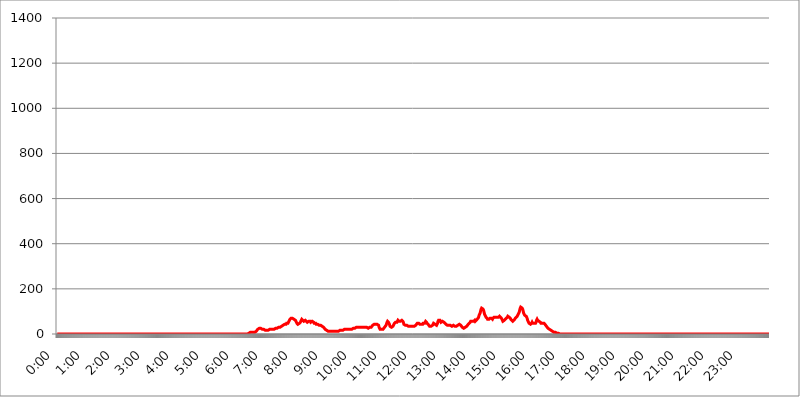
| Category | 2016.02.23. Intenzitás [W/m^2] |
|---|---|
| 0.0 | 0 |
| 0.0006944444444444445 | 0 |
| 0.001388888888888889 | 0 |
| 0.0020833333333333333 | 0 |
| 0.002777777777777778 | 0 |
| 0.003472222222222222 | 0 |
| 0.004166666666666667 | 0 |
| 0.004861111111111111 | 0 |
| 0.005555555555555556 | 0 |
| 0.0062499999999999995 | 0 |
| 0.006944444444444444 | 0 |
| 0.007638888888888889 | 0 |
| 0.008333333333333333 | 0 |
| 0.009027777777777779 | 0 |
| 0.009722222222222222 | 0 |
| 0.010416666666666666 | 0 |
| 0.011111111111111112 | 0 |
| 0.011805555555555555 | 0 |
| 0.012499999999999999 | 0 |
| 0.013194444444444444 | 0 |
| 0.013888888888888888 | 0 |
| 0.014583333333333332 | 0 |
| 0.015277777777777777 | 0 |
| 0.015972222222222224 | 0 |
| 0.016666666666666666 | 0 |
| 0.017361111111111112 | 0 |
| 0.018055555555555557 | 0 |
| 0.01875 | 0 |
| 0.019444444444444445 | 0 |
| 0.02013888888888889 | 0 |
| 0.020833333333333332 | 0 |
| 0.02152777777777778 | 0 |
| 0.022222222222222223 | 0 |
| 0.02291666666666667 | 0 |
| 0.02361111111111111 | 0 |
| 0.024305555555555556 | 0 |
| 0.024999999999999998 | 0 |
| 0.025694444444444447 | 0 |
| 0.02638888888888889 | 0 |
| 0.027083333333333334 | 0 |
| 0.027777777777777776 | 0 |
| 0.02847222222222222 | 0 |
| 0.029166666666666664 | 0 |
| 0.029861111111111113 | 0 |
| 0.030555555555555555 | 0 |
| 0.03125 | 0 |
| 0.03194444444444445 | 0 |
| 0.03263888888888889 | 0 |
| 0.03333333333333333 | 0 |
| 0.034027777777777775 | 0 |
| 0.034722222222222224 | 0 |
| 0.035416666666666666 | 0 |
| 0.036111111111111115 | 0 |
| 0.03680555555555556 | 0 |
| 0.0375 | 0 |
| 0.03819444444444444 | 0 |
| 0.03888888888888889 | 0 |
| 0.03958333333333333 | 0 |
| 0.04027777777777778 | 0 |
| 0.04097222222222222 | 0 |
| 0.041666666666666664 | 0 |
| 0.042361111111111106 | 0 |
| 0.04305555555555556 | 0 |
| 0.043750000000000004 | 0 |
| 0.044444444444444446 | 0 |
| 0.04513888888888889 | 0 |
| 0.04583333333333334 | 0 |
| 0.04652777777777778 | 0 |
| 0.04722222222222222 | 0 |
| 0.04791666666666666 | 0 |
| 0.04861111111111111 | 0 |
| 0.049305555555555554 | 0 |
| 0.049999999999999996 | 0 |
| 0.05069444444444445 | 0 |
| 0.051388888888888894 | 0 |
| 0.052083333333333336 | 0 |
| 0.05277777777777778 | 0 |
| 0.05347222222222222 | 0 |
| 0.05416666666666667 | 0 |
| 0.05486111111111111 | 0 |
| 0.05555555555555555 | 0 |
| 0.05625 | 0 |
| 0.05694444444444444 | 0 |
| 0.057638888888888885 | 0 |
| 0.05833333333333333 | 0 |
| 0.05902777777777778 | 0 |
| 0.059722222222222225 | 0 |
| 0.06041666666666667 | 0 |
| 0.061111111111111116 | 0 |
| 0.06180555555555556 | 0 |
| 0.0625 | 0 |
| 0.06319444444444444 | 0 |
| 0.06388888888888888 | 0 |
| 0.06458333333333334 | 0 |
| 0.06527777777777778 | 0 |
| 0.06597222222222222 | 0 |
| 0.06666666666666667 | 0 |
| 0.06736111111111111 | 0 |
| 0.06805555555555555 | 0 |
| 0.06874999999999999 | 0 |
| 0.06944444444444443 | 0 |
| 0.07013888888888889 | 0 |
| 0.07083333333333333 | 0 |
| 0.07152777777777779 | 0 |
| 0.07222222222222223 | 0 |
| 0.07291666666666667 | 0 |
| 0.07361111111111111 | 0 |
| 0.07430555555555556 | 0 |
| 0.075 | 0 |
| 0.07569444444444444 | 0 |
| 0.0763888888888889 | 0 |
| 0.07708333333333334 | 0 |
| 0.07777777777777778 | 0 |
| 0.07847222222222222 | 0 |
| 0.07916666666666666 | 0 |
| 0.0798611111111111 | 0 |
| 0.08055555555555556 | 0 |
| 0.08125 | 0 |
| 0.08194444444444444 | 0 |
| 0.08263888888888889 | 0 |
| 0.08333333333333333 | 0 |
| 0.08402777777777777 | 0 |
| 0.08472222222222221 | 0 |
| 0.08541666666666665 | 0 |
| 0.08611111111111112 | 0 |
| 0.08680555555555557 | 0 |
| 0.08750000000000001 | 0 |
| 0.08819444444444445 | 0 |
| 0.08888888888888889 | 0 |
| 0.08958333333333333 | 0 |
| 0.09027777777777778 | 0 |
| 0.09097222222222222 | 0 |
| 0.09166666666666667 | 0 |
| 0.09236111111111112 | 0 |
| 0.09305555555555556 | 0 |
| 0.09375 | 0 |
| 0.09444444444444444 | 0 |
| 0.09513888888888888 | 0 |
| 0.09583333333333333 | 0 |
| 0.09652777777777777 | 0 |
| 0.09722222222222222 | 0 |
| 0.09791666666666667 | 0 |
| 0.09861111111111111 | 0 |
| 0.09930555555555555 | 0 |
| 0.09999999999999999 | 0 |
| 0.10069444444444443 | 0 |
| 0.1013888888888889 | 0 |
| 0.10208333333333335 | 0 |
| 0.10277777777777779 | 0 |
| 0.10347222222222223 | 0 |
| 0.10416666666666667 | 0 |
| 0.10486111111111111 | 0 |
| 0.10555555555555556 | 0 |
| 0.10625 | 0 |
| 0.10694444444444444 | 0 |
| 0.1076388888888889 | 0 |
| 0.10833333333333334 | 0 |
| 0.10902777777777778 | 0 |
| 0.10972222222222222 | 0 |
| 0.1111111111111111 | 0 |
| 0.11180555555555556 | 0 |
| 0.11180555555555556 | 0 |
| 0.1125 | 0 |
| 0.11319444444444444 | 0 |
| 0.11388888888888889 | 0 |
| 0.11458333333333333 | 0 |
| 0.11527777777777777 | 0 |
| 0.11597222222222221 | 0 |
| 0.11666666666666665 | 0 |
| 0.1173611111111111 | 0 |
| 0.11805555555555557 | 0 |
| 0.11944444444444445 | 0 |
| 0.12013888888888889 | 0 |
| 0.12083333333333333 | 0 |
| 0.12152777777777778 | 0 |
| 0.12222222222222223 | 0 |
| 0.12291666666666667 | 0 |
| 0.12291666666666667 | 0 |
| 0.12361111111111112 | 0 |
| 0.12430555555555556 | 0 |
| 0.125 | 0 |
| 0.12569444444444444 | 0 |
| 0.12638888888888888 | 0 |
| 0.12708333333333333 | 0 |
| 0.16875 | 0 |
| 0.12847222222222224 | 0 |
| 0.12916666666666668 | 0 |
| 0.12986111111111112 | 0 |
| 0.13055555555555556 | 0 |
| 0.13125 | 0 |
| 0.13194444444444445 | 0 |
| 0.1326388888888889 | 0 |
| 0.13333333333333333 | 0 |
| 0.13402777777777777 | 0 |
| 0.13402777777777777 | 0 |
| 0.13472222222222222 | 0 |
| 0.13541666666666666 | 0 |
| 0.1361111111111111 | 0 |
| 0.13749999999999998 | 0 |
| 0.13819444444444443 | 0 |
| 0.1388888888888889 | 0 |
| 0.13958333333333334 | 0 |
| 0.14027777777777778 | 0 |
| 0.14097222222222222 | 0 |
| 0.14166666666666666 | 0 |
| 0.1423611111111111 | 0 |
| 0.14305555555555557 | 0 |
| 0.14375000000000002 | 0 |
| 0.14444444444444446 | 0 |
| 0.1451388888888889 | 0 |
| 0.1451388888888889 | 0 |
| 0.14652777777777778 | 0 |
| 0.14722222222222223 | 0 |
| 0.14791666666666667 | 0 |
| 0.1486111111111111 | 0 |
| 0.14930555555555555 | 0 |
| 0.15 | 0 |
| 0.15069444444444444 | 0 |
| 0.15138888888888888 | 0 |
| 0.15208333333333332 | 0 |
| 0.15277777777777776 | 0 |
| 0.15347222222222223 | 0 |
| 0.15416666666666667 | 0 |
| 0.15486111111111112 | 0 |
| 0.15555555555555556 | 0 |
| 0.15625 | 0 |
| 0.15694444444444444 | 0 |
| 0.15763888888888888 | 0 |
| 0.15833333333333333 | 0 |
| 0.15902777777777777 | 0 |
| 0.15972222222222224 | 0 |
| 0.16041666666666668 | 0 |
| 0.16111111111111112 | 0 |
| 0.16180555555555556 | 0 |
| 0.1625 | 0 |
| 0.16319444444444445 | 0 |
| 0.1638888888888889 | 0 |
| 0.16458333333333333 | 0 |
| 0.16527777777777777 | 0 |
| 0.16597222222222222 | 0 |
| 0.16666666666666666 | 0 |
| 0.1673611111111111 | 0 |
| 0.16805555555555554 | 0 |
| 0.16874999999999998 | 0 |
| 0.16944444444444443 | 0 |
| 0.17013888888888887 | 0 |
| 0.1708333333333333 | 0 |
| 0.17152777777777775 | 0 |
| 0.17222222222222225 | 0 |
| 0.1729166666666667 | 0 |
| 0.17361111111111113 | 0 |
| 0.17430555555555557 | 0 |
| 0.17500000000000002 | 0 |
| 0.17569444444444446 | 0 |
| 0.1763888888888889 | 0 |
| 0.17708333333333334 | 0 |
| 0.17777777777777778 | 0 |
| 0.17847222222222223 | 0 |
| 0.17916666666666667 | 0 |
| 0.1798611111111111 | 0 |
| 0.18055555555555555 | 0 |
| 0.18125 | 0 |
| 0.18194444444444444 | 0 |
| 0.1826388888888889 | 0 |
| 0.18333333333333335 | 0 |
| 0.1840277777777778 | 0 |
| 0.18472222222222223 | 0 |
| 0.18541666666666667 | 0 |
| 0.18611111111111112 | 0 |
| 0.18680555555555556 | 0 |
| 0.1875 | 0 |
| 0.18819444444444444 | 0 |
| 0.18888888888888888 | 0 |
| 0.18958333333333333 | 0 |
| 0.19027777777777777 | 0 |
| 0.1909722222222222 | 0 |
| 0.19166666666666665 | 0 |
| 0.19236111111111112 | 0 |
| 0.19305555555555554 | 0 |
| 0.19375 | 0 |
| 0.19444444444444445 | 0 |
| 0.1951388888888889 | 0 |
| 0.19583333333333333 | 0 |
| 0.19652777777777777 | 0 |
| 0.19722222222222222 | 0 |
| 0.19791666666666666 | 0 |
| 0.1986111111111111 | 0 |
| 0.19930555555555554 | 0 |
| 0.19999999999999998 | 0 |
| 0.20069444444444443 | 0 |
| 0.20138888888888887 | 0 |
| 0.2020833333333333 | 0 |
| 0.2027777777777778 | 0 |
| 0.2034722222222222 | 0 |
| 0.2041666666666667 | 0 |
| 0.20486111111111113 | 0 |
| 0.20555555555555557 | 0 |
| 0.20625000000000002 | 0 |
| 0.20694444444444446 | 0 |
| 0.2076388888888889 | 0 |
| 0.20833333333333334 | 0 |
| 0.20902777777777778 | 0 |
| 0.20972222222222223 | 0 |
| 0.21041666666666667 | 0 |
| 0.2111111111111111 | 0 |
| 0.21180555555555555 | 0 |
| 0.2125 | 0 |
| 0.21319444444444444 | 0 |
| 0.2138888888888889 | 0 |
| 0.21458333333333335 | 0 |
| 0.2152777777777778 | 0 |
| 0.21597222222222223 | 0 |
| 0.21666666666666667 | 0 |
| 0.21736111111111112 | 0 |
| 0.21805555555555556 | 0 |
| 0.21875 | 0 |
| 0.21944444444444444 | 0 |
| 0.22013888888888888 | 0 |
| 0.22083333333333333 | 0 |
| 0.22152777777777777 | 0 |
| 0.2222222222222222 | 0 |
| 0.22291666666666665 | 0 |
| 0.2236111111111111 | 0 |
| 0.22430555555555556 | 0 |
| 0.225 | 0 |
| 0.22569444444444445 | 0 |
| 0.2263888888888889 | 0 |
| 0.22708333333333333 | 0 |
| 0.22777777777777777 | 0 |
| 0.22847222222222222 | 0 |
| 0.22916666666666666 | 0 |
| 0.2298611111111111 | 0 |
| 0.23055555555555554 | 0 |
| 0.23124999999999998 | 0 |
| 0.23194444444444443 | 0 |
| 0.23263888888888887 | 0 |
| 0.2333333333333333 | 0 |
| 0.2340277777777778 | 0 |
| 0.2347222222222222 | 0 |
| 0.2354166666666667 | 0 |
| 0.23611111111111113 | 0 |
| 0.23680555555555557 | 0 |
| 0.23750000000000002 | 0 |
| 0.23819444444444446 | 0 |
| 0.2388888888888889 | 0 |
| 0.23958333333333334 | 0 |
| 0.24027777777777778 | 0 |
| 0.24097222222222223 | 0 |
| 0.24166666666666667 | 0 |
| 0.2423611111111111 | 0 |
| 0.24305555555555555 | 0 |
| 0.24375 | 0 |
| 0.24444444444444446 | 0 |
| 0.24513888888888888 | 0 |
| 0.24583333333333335 | 0 |
| 0.2465277777777778 | 0 |
| 0.24722222222222223 | 0 |
| 0.24791666666666667 | 0 |
| 0.24861111111111112 | 0 |
| 0.24930555555555556 | 0 |
| 0.25 | 0 |
| 0.25069444444444444 | 0 |
| 0.2513888888888889 | 0 |
| 0.2520833333333333 | 0 |
| 0.25277777777777777 | 0 |
| 0.2534722222222222 | 0 |
| 0.25416666666666665 | 0 |
| 0.2548611111111111 | 0 |
| 0.2555555555555556 | 0 |
| 0.25625000000000003 | 0 |
| 0.2569444444444445 | 0 |
| 0.2576388888888889 | 0 |
| 0.25833333333333336 | 0 |
| 0.2590277777777778 | 0 |
| 0.25972222222222224 | 0 |
| 0.2604166666666667 | 0 |
| 0.2611111111111111 | 0 |
| 0.26180555555555557 | 0 |
| 0.2625 | 0 |
| 0.26319444444444445 | 0 |
| 0.2638888888888889 | 0 |
| 0.26458333333333334 | 0 |
| 0.2652777777777778 | 0 |
| 0.2659722222222222 | 0 |
| 0.26666666666666666 | 0 |
| 0.2673611111111111 | 0 |
| 0.26805555555555555 | 0 |
| 0.26875 | 3.525 |
| 0.26944444444444443 | 3.525 |
| 0.2701388888888889 | 3.525 |
| 0.2708333333333333 | 7.887 |
| 0.27152777777777776 | 7.887 |
| 0.2722222222222222 | 7.887 |
| 0.27291666666666664 | 7.887 |
| 0.2736111111111111 | 7.887 |
| 0.2743055555555555 | 7.887 |
| 0.27499999999999997 | 7.887 |
| 0.27569444444444446 | 7.887 |
| 0.27638888888888885 | 7.887 |
| 0.27708333333333335 | 7.887 |
| 0.2777777777777778 | 7.887 |
| 0.27847222222222223 | 12.257 |
| 0.2791666666666667 | 12.257 |
| 0.2798611111111111 | 12.257 |
| 0.28055555555555556 | 16.636 |
| 0.28125 | 21.024 |
| 0.28194444444444444 | 21.024 |
| 0.2826388888888889 | 25.419 |
| 0.2833333333333333 | 25.419 |
| 0.28402777777777777 | 25.419 |
| 0.2847222222222222 | 25.419 |
| 0.28541666666666665 | 25.419 |
| 0.28611111111111115 | 25.419 |
| 0.28680555555555554 | 21.024 |
| 0.28750000000000003 | 21.024 |
| 0.2881944444444445 | 21.024 |
| 0.2888888888888889 | 21.024 |
| 0.28958333333333336 | 21.024 |
| 0.2902777777777778 | 21.024 |
| 0.29097222222222224 | 21.024 |
| 0.2916666666666667 | 16.636 |
| 0.2923611111111111 | 16.636 |
| 0.29305555555555557 | 16.636 |
| 0.29375 | 16.636 |
| 0.29444444444444445 | 16.636 |
| 0.2951388888888889 | 16.636 |
| 0.29583333333333334 | 16.636 |
| 0.2965277777777778 | 16.636 |
| 0.2972222222222222 | 21.024 |
| 0.29791666666666666 | 21.024 |
| 0.2986111111111111 | 21.024 |
| 0.29930555555555555 | 21.024 |
| 0.3 | 21.024 |
| 0.30069444444444443 | 21.024 |
| 0.3013888888888889 | 21.024 |
| 0.3020833333333333 | 21.024 |
| 0.30277777777777776 | 16.636 |
| 0.3034722222222222 | 16.636 |
| 0.30416666666666664 | 21.024 |
| 0.3048611111111111 | 21.024 |
| 0.3055555555555555 | 21.024 |
| 0.30624999999999997 | 25.419 |
| 0.3069444444444444 | 25.419 |
| 0.3076388888888889 | 25.419 |
| 0.30833333333333335 | 25.419 |
| 0.3090277777777778 | 29.823 |
| 0.30972222222222223 | 29.823 |
| 0.3104166666666667 | 29.823 |
| 0.3111111111111111 | 29.823 |
| 0.31180555555555556 | 29.823 |
| 0.3125 | 29.823 |
| 0.31319444444444444 | 34.234 |
| 0.3138888888888889 | 34.234 |
| 0.3145833333333333 | 34.234 |
| 0.31527777777777777 | 38.653 |
| 0.3159722222222222 | 38.653 |
| 0.31666666666666665 | 38.653 |
| 0.31736111111111115 | 38.653 |
| 0.31805555555555554 | 38.653 |
| 0.31875000000000003 | 43.079 |
| 0.3194444444444445 | 43.079 |
| 0.3201388888888889 | 43.079 |
| 0.32083333333333336 | 43.079 |
| 0.3215277777777778 | 47.511 |
| 0.32222222222222224 | 47.511 |
| 0.3229166666666667 | 47.511 |
| 0.3236111111111111 | 47.511 |
| 0.32430555555555557 | 51.951 |
| 0.325 | 56.398 |
| 0.32569444444444445 | 60.85 |
| 0.3263888888888889 | 65.31 |
| 0.32708333333333334 | 65.31 |
| 0.3277777777777778 | 69.775 |
| 0.3284722222222222 | 69.775 |
| 0.32916666666666666 | 69.775 |
| 0.3298611111111111 | 69.775 |
| 0.33055555555555555 | 69.775 |
| 0.33125 | 69.775 |
| 0.33194444444444443 | 65.31 |
| 0.3326388888888889 | 65.31 |
| 0.3333333333333333 | 65.31 |
| 0.3340277777777778 | 60.85 |
| 0.3347222222222222 | 56.398 |
| 0.3354166666666667 | 51.951 |
| 0.3361111111111111 | 47.511 |
| 0.3368055555555556 | 47.511 |
| 0.33749999999999997 | 43.079 |
| 0.33819444444444446 | 43.079 |
| 0.33888888888888885 | 43.079 |
| 0.33958333333333335 | 47.511 |
| 0.34027777777777773 | 47.511 |
| 0.34097222222222223 | 51.951 |
| 0.3416666666666666 | 56.398 |
| 0.3423611111111111 | 60.85 |
| 0.3430555555555555 | 65.31 |
| 0.34375 | 65.31 |
| 0.3444444444444445 | 60.85 |
| 0.3451388888888889 | 60.85 |
| 0.3458333333333334 | 56.398 |
| 0.34652777777777777 | 56.398 |
| 0.34722222222222227 | 56.398 |
| 0.34791666666666665 | 60.85 |
| 0.34861111111111115 | 60.85 |
| 0.34930555555555554 | 56.398 |
| 0.35000000000000003 | 56.398 |
| 0.3506944444444444 | 51.951 |
| 0.3513888888888889 | 51.951 |
| 0.3520833333333333 | 51.951 |
| 0.3527777777777778 | 56.398 |
| 0.3534722222222222 | 56.398 |
| 0.3541666666666667 | 56.398 |
| 0.3548611111111111 | 56.398 |
| 0.35555555555555557 | 51.951 |
| 0.35625 | 51.951 |
| 0.35694444444444445 | 51.951 |
| 0.3576388888888889 | 56.398 |
| 0.35833333333333334 | 56.398 |
| 0.3590277777777778 | 56.398 |
| 0.3597222222222222 | 51.951 |
| 0.36041666666666666 | 47.511 |
| 0.3611111111111111 | 47.511 |
| 0.36180555555555555 | 47.511 |
| 0.3625 | 47.511 |
| 0.36319444444444443 | 43.079 |
| 0.3638888888888889 | 43.079 |
| 0.3645833333333333 | 43.079 |
| 0.3652777777777778 | 43.079 |
| 0.3659722222222222 | 43.079 |
| 0.3666666666666667 | 43.079 |
| 0.3673611111111111 | 38.653 |
| 0.3680555555555556 | 38.653 |
| 0.36874999999999997 | 38.653 |
| 0.36944444444444446 | 38.653 |
| 0.37013888888888885 | 38.653 |
| 0.37083333333333335 | 38.653 |
| 0.37152777777777773 | 34.234 |
| 0.37222222222222223 | 34.234 |
| 0.3729166666666666 | 29.823 |
| 0.3736111111111111 | 29.823 |
| 0.3743055555555555 | 29.823 |
| 0.375 | 25.419 |
| 0.3756944444444445 | 21.024 |
| 0.3763888888888889 | 21.024 |
| 0.3770833333333334 | 16.636 |
| 0.37777777777777777 | 16.636 |
| 0.37847222222222227 | 16.636 |
| 0.37916666666666665 | 12.257 |
| 0.37986111111111115 | 12.257 |
| 0.38055555555555554 | 12.257 |
| 0.38125000000000003 | 12.257 |
| 0.3819444444444444 | 12.257 |
| 0.3826388888888889 | 12.257 |
| 0.3833333333333333 | 12.257 |
| 0.3840277777777778 | 12.257 |
| 0.3847222222222222 | 12.257 |
| 0.3854166666666667 | 12.257 |
| 0.3861111111111111 | 12.257 |
| 0.38680555555555557 | 12.257 |
| 0.3875 | 12.257 |
| 0.38819444444444445 | 12.257 |
| 0.3888888888888889 | 12.257 |
| 0.38958333333333334 | 12.257 |
| 0.3902777777777778 | 12.257 |
| 0.3909722222222222 | 12.257 |
| 0.39166666666666666 | 12.257 |
| 0.3923611111111111 | 12.257 |
| 0.39305555555555555 | 12.257 |
| 0.39375 | 12.257 |
| 0.39444444444444443 | 12.257 |
| 0.3951388888888889 | 12.257 |
| 0.3958333333333333 | 12.257 |
| 0.3965277777777778 | 16.636 |
| 0.3972222222222222 | 16.636 |
| 0.3979166666666667 | 16.636 |
| 0.3986111111111111 | 16.636 |
| 0.3993055555555556 | 16.636 |
| 0.39999999999999997 | 16.636 |
| 0.40069444444444446 | 16.636 |
| 0.40138888888888885 | 21.024 |
| 0.40208333333333335 | 21.024 |
| 0.40277777777777773 | 21.024 |
| 0.40347222222222223 | 21.024 |
| 0.4041666666666666 | 21.024 |
| 0.4048611111111111 | 21.024 |
| 0.4055555555555555 | 21.024 |
| 0.40625 | 21.024 |
| 0.4069444444444445 | 21.024 |
| 0.4076388888888889 | 21.024 |
| 0.4083333333333334 | 21.024 |
| 0.40902777777777777 | 21.024 |
| 0.40972222222222227 | 21.024 |
| 0.41041666666666665 | 21.024 |
| 0.41111111111111115 | 21.024 |
| 0.41180555555555554 | 21.024 |
| 0.41250000000000003 | 21.024 |
| 0.4131944444444444 | 21.024 |
| 0.4138888888888889 | 21.024 |
| 0.4145833333333333 | 21.024 |
| 0.4152777777777778 | 25.419 |
| 0.4159722222222222 | 25.419 |
| 0.4166666666666667 | 25.419 |
| 0.4173611111111111 | 25.419 |
| 0.41805555555555557 | 29.823 |
| 0.41875 | 29.823 |
| 0.41944444444444445 | 29.823 |
| 0.4201388888888889 | 25.419 |
| 0.42083333333333334 | 29.823 |
| 0.4215277777777778 | 29.823 |
| 0.4222222222222222 | 29.823 |
| 0.42291666666666666 | 29.823 |
| 0.4236111111111111 | 29.823 |
| 0.42430555555555555 | 29.823 |
| 0.425 | 29.823 |
| 0.42569444444444443 | 29.823 |
| 0.4263888888888889 | 29.823 |
| 0.4270833333333333 | 29.823 |
| 0.4277777777777778 | 29.823 |
| 0.4284722222222222 | 29.823 |
| 0.4291666666666667 | 29.823 |
| 0.4298611111111111 | 29.823 |
| 0.4305555555555556 | 29.823 |
| 0.43124999999999997 | 29.823 |
| 0.43194444444444446 | 29.823 |
| 0.43263888888888885 | 29.823 |
| 0.43333333333333335 | 29.823 |
| 0.43402777777777773 | 29.823 |
| 0.43472222222222223 | 29.823 |
| 0.4354166666666666 | 25.419 |
| 0.4361111111111111 | 25.419 |
| 0.4368055555555555 | 25.419 |
| 0.4375 | 29.823 |
| 0.4381944444444445 | 29.823 |
| 0.4388888888888889 | 29.823 |
| 0.4395833333333334 | 29.823 |
| 0.44027777777777777 | 29.823 |
| 0.44097222222222227 | 29.823 |
| 0.44166666666666665 | 34.234 |
| 0.44236111111111115 | 38.653 |
| 0.44305555555555554 | 38.653 |
| 0.44375000000000003 | 43.079 |
| 0.4444444444444444 | 43.079 |
| 0.4451388888888889 | 43.079 |
| 0.4458333333333333 | 43.079 |
| 0.4465277777777778 | 43.079 |
| 0.4472222222222222 | 43.079 |
| 0.4479166666666667 | 43.079 |
| 0.4486111111111111 | 43.079 |
| 0.44930555555555557 | 43.079 |
| 0.45 | 38.653 |
| 0.45069444444444445 | 38.653 |
| 0.4513888888888889 | 29.823 |
| 0.45208333333333334 | 25.419 |
| 0.4527777777777778 | 21.024 |
| 0.4534722222222222 | 21.024 |
| 0.45416666666666666 | 21.024 |
| 0.4548611111111111 | 21.024 |
| 0.45555555555555555 | 21.024 |
| 0.45625 | 21.024 |
| 0.45694444444444443 | 21.024 |
| 0.4576388888888889 | 25.419 |
| 0.4583333333333333 | 25.419 |
| 0.4590277777777778 | 29.823 |
| 0.4597222222222222 | 29.823 |
| 0.4604166666666667 | 34.234 |
| 0.4611111111111111 | 38.653 |
| 0.4618055555555556 | 43.079 |
| 0.46249999999999997 | 51.951 |
| 0.46319444444444446 | 56.398 |
| 0.46388888888888885 | 56.398 |
| 0.46458333333333335 | 51.951 |
| 0.46527777777777773 | 47.511 |
| 0.46597222222222223 | 43.079 |
| 0.4666666666666666 | 34.234 |
| 0.4673611111111111 | 29.823 |
| 0.4680555555555555 | 29.823 |
| 0.46875 | 29.823 |
| 0.4694444444444445 | 34.234 |
| 0.4701388888888889 | 34.234 |
| 0.4708333333333334 | 34.234 |
| 0.47152777777777777 | 38.653 |
| 0.47222222222222227 | 43.079 |
| 0.47291666666666665 | 47.511 |
| 0.47361111111111115 | 47.511 |
| 0.47430555555555554 | 51.951 |
| 0.47500000000000003 | 51.951 |
| 0.4756944444444444 | 51.951 |
| 0.4763888888888889 | 51.951 |
| 0.4770833333333333 | 56.398 |
| 0.4777777777777778 | 60.85 |
| 0.4784722222222222 | 60.85 |
| 0.4791666666666667 | 56.398 |
| 0.4798611111111111 | 56.398 |
| 0.48055555555555557 | 56.398 |
| 0.48125 | 56.398 |
| 0.48194444444444445 | 56.398 |
| 0.4826388888888889 | 56.398 |
| 0.48333333333333334 | 60.85 |
| 0.4840277777777778 | 60.85 |
| 0.4847222222222222 | 56.398 |
| 0.48541666666666666 | 51.951 |
| 0.4861111111111111 | 43.079 |
| 0.48680555555555555 | 43.079 |
| 0.4875 | 38.653 |
| 0.48819444444444443 | 38.653 |
| 0.4888888888888889 | 38.653 |
| 0.4895833333333333 | 38.653 |
| 0.4902777777777778 | 38.653 |
| 0.4909722222222222 | 34.234 |
| 0.4916666666666667 | 34.234 |
| 0.4923611111111111 | 34.234 |
| 0.4930555555555556 | 34.234 |
| 0.49374999999999997 | 34.234 |
| 0.49444444444444446 | 34.234 |
| 0.49513888888888885 | 34.234 |
| 0.49583333333333335 | 34.234 |
| 0.49652777777777773 | 34.234 |
| 0.49722222222222223 | 34.234 |
| 0.4979166666666666 | 34.234 |
| 0.4986111111111111 | 34.234 |
| 0.4993055555555555 | 34.234 |
| 0.5 | 34.234 |
| 0.5006944444444444 | 34.234 |
| 0.5013888888888889 | 34.234 |
| 0.5020833333333333 | 34.234 |
| 0.5027777777777778 | 38.653 |
| 0.5034722222222222 | 38.653 |
| 0.5041666666666667 | 43.079 |
| 0.5048611111111111 | 47.511 |
| 0.5055555555555555 | 47.511 |
| 0.50625 | 47.511 |
| 0.5069444444444444 | 47.511 |
| 0.5076388888888889 | 47.511 |
| 0.5083333333333333 | 43.079 |
| 0.5090277777777777 | 43.079 |
| 0.5097222222222222 | 43.079 |
| 0.5104166666666666 | 43.079 |
| 0.5111111111111112 | 43.079 |
| 0.5118055555555555 | 43.079 |
| 0.5125000000000001 | 43.079 |
| 0.5131944444444444 | 47.511 |
| 0.513888888888889 | 47.511 |
| 0.5145833333333333 | 47.511 |
| 0.5152777777777778 | 47.511 |
| 0.5159722222222222 | 51.951 |
| 0.5166666666666667 | 56.398 |
| 0.517361111111111 | 56.398 |
| 0.5180555555555556 | 51.951 |
| 0.5187499999999999 | 47.511 |
| 0.5194444444444445 | 47.511 |
| 0.5201388888888888 | 43.079 |
| 0.5208333333333334 | 38.653 |
| 0.5215277777777778 | 38.653 |
| 0.5222222222222223 | 34.234 |
| 0.5229166666666667 | 34.234 |
| 0.5236111111111111 | 34.234 |
| 0.5243055555555556 | 34.234 |
| 0.525 | 34.234 |
| 0.5256944444444445 | 38.653 |
| 0.5263888888888889 | 38.653 |
| 0.5270833333333333 | 43.079 |
| 0.5277777777777778 | 47.511 |
| 0.5284722222222222 | 47.511 |
| 0.5291666666666667 | 47.511 |
| 0.5298611111111111 | 43.079 |
| 0.5305555555555556 | 38.653 |
| 0.53125 | 38.653 |
| 0.5319444444444444 | 38.653 |
| 0.5326388888888889 | 43.079 |
| 0.5333333333333333 | 47.511 |
| 0.5340277777777778 | 56.398 |
| 0.5347222222222222 | 60.85 |
| 0.5354166666666667 | 60.85 |
| 0.5361111111111111 | 60.85 |
| 0.5368055555555555 | 60.85 |
| 0.5375 | 56.398 |
| 0.5381944444444444 | 51.951 |
| 0.5388888888888889 | 51.951 |
| 0.5395833333333333 | 51.951 |
| 0.5402777777777777 | 56.398 |
| 0.5409722222222222 | 56.398 |
| 0.5416666666666666 | 56.398 |
| 0.5423611111111112 | 51.951 |
| 0.5430555555555555 | 51.951 |
| 0.5437500000000001 | 47.511 |
| 0.5444444444444444 | 47.511 |
| 0.545138888888889 | 43.079 |
| 0.5458333333333333 | 38.653 |
| 0.5465277777777778 | 38.653 |
| 0.5472222222222222 | 38.653 |
| 0.5479166666666667 | 38.653 |
| 0.548611111111111 | 38.653 |
| 0.5493055555555556 | 38.653 |
| 0.5499999999999999 | 38.653 |
| 0.5506944444444445 | 38.653 |
| 0.5513888888888888 | 38.653 |
| 0.5520833333333334 | 34.234 |
| 0.5527777777777778 | 34.234 |
| 0.5534722222222223 | 34.234 |
| 0.5541666666666667 | 34.234 |
| 0.5548611111111111 | 38.653 |
| 0.5555555555555556 | 38.653 |
| 0.55625 | 38.653 |
| 0.5569444444444445 | 38.653 |
| 0.5576388888888889 | 34.234 |
| 0.5583333333333333 | 34.234 |
| 0.5590277777777778 | 34.234 |
| 0.5597222222222222 | 34.234 |
| 0.5604166666666667 | 34.234 |
| 0.5611111111111111 | 34.234 |
| 0.5618055555555556 | 38.653 |
| 0.5625 | 38.653 |
| 0.5631944444444444 | 38.653 |
| 0.5638888888888889 | 43.079 |
| 0.5645833333333333 | 38.653 |
| 0.5652777777777778 | 38.653 |
| 0.5659722222222222 | 38.653 |
| 0.5666666666666667 | 38.653 |
| 0.5673611111111111 | 34.234 |
| 0.5680555555555555 | 29.823 |
| 0.56875 | 29.823 |
| 0.5694444444444444 | 25.419 |
| 0.5701388888888889 | 25.419 |
| 0.5708333333333333 | 29.823 |
| 0.5715277777777777 | 29.823 |
| 0.5722222222222222 | 29.823 |
| 0.5729166666666666 | 29.823 |
| 0.5736111111111112 | 34.234 |
| 0.5743055555555555 | 34.234 |
| 0.5750000000000001 | 38.653 |
| 0.5756944444444444 | 38.653 |
| 0.576388888888889 | 43.079 |
| 0.5770833333333333 | 43.079 |
| 0.5777777777777778 | 47.511 |
| 0.5784722222222222 | 47.511 |
| 0.5791666666666667 | 51.951 |
| 0.579861111111111 | 56.398 |
| 0.5805555555555556 | 56.398 |
| 0.5812499999999999 | 56.398 |
| 0.5819444444444445 | 56.398 |
| 0.5826388888888888 | 56.398 |
| 0.5833333333333334 | 56.398 |
| 0.5840277777777778 | 56.398 |
| 0.5847222222222223 | 56.398 |
| 0.5854166666666667 | 60.85 |
| 0.5861111111111111 | 56.398 |
| 0.5868055555555556 | 56.398 |
| 0.5875 | 60.85 |
| 0.5881944444444445 | 60.85 |
| 0.5888888888888889 | 65.31 |
| 0.5895833333333333 | 65.31 |
| 0.5902777777777778 | 69.775 |
| 0.5909722222222222 | 74.246 |
| 0.5916666666666667 | 83.205 |
| 0.5923611111111111 | 87.692 |
| 0.5930555555555556 | 92.184 |
| 0.59375 | 101.184 |
| 0.5944444444444444 | 110.201 |
| 0.5951388888888889 | 114.716 |
| 0.5958333333333333 | 114.716 |
| 0.5965277777777778 | 114.716 |
| 0.5972222222222222 | 110.201 |
| 0.5979166666666667 | 105.69 |
| 0.5986111111111111 | 96.682 |
| 0.5993055555555555 | 87.692 |
| 0.6 | 83.205 |
| 0.6006944444444444 | 78.722 |
| 0.6013888888888889 | 74.246 |
| 0.6020833333333333 | 74.246 |
| 0.6027777777777777 | 69.775 |
| 0.6034722222222222 | 65.31 |
| 0.6041666666666666 | 65.31 |
| 0.6048611111111112 | 65.31 |
| 0.6055555555555555 | 65.31 |
| 0.6062500000000001 | 65.31 |
| 0.6069444444444444 | 69.775 |
| 0.607638888888889 | 69.775 |
| 0.6083333333333333 | 69.775 |
| 0.6090277777777778 | 69.775 |
| 0.6097222222222222 | 69.775 |
| 0.6104166666666667 | 65.31 |
| 0.611111111111111 | 69.775 |
| 0.6118055555555556 | 69.775 |
| 0.6124999999999999 | 74.246 |
| 0.6131944444444445 | 74.246 |
| 0.6138888888888888 | 74.246 |
| 0.6145833333333334 | 74.246 |
| 0.6152777777777778 | 74.246 |
| 0.6159722222222223 | 74.246 |
| 0.6166666666666667 | 74.246 |
| 0.6173611111111111 | 74.246 |
| 0.6180555555555556 | 74.246 |
| 0.61875 | 74.246 |
| 0.6194444444444445 | 74.246 |
| 0.6201388888888889 | 78.722 |
| 0.6208333333333333 | 78.722 |
| 0.6215277777777778 | 74.246 |
| 0.6222222222222222 | 74.246 |
| 0.6229166666666667 | 69.775 |
| 0.6236111111111111 | 65.31 |
| 0.6243055555555556 | 60.85 |
| 0.625 | 56.398 |
| 0.6256944444444444 | 56.398 |
| 0.6263888888888889 | 56.398 |
| 0.6270833333333333 | 60.85 |
| 0.6277777777777778 | 60.85 |
| 0.6284722222222222 | 65.31 |
| 0.6291666666666667 | 65.31 |
| 0.6298611111111111 | 69.775 |
| 0.6305555555555555 | 69.775 |
| 0.63125 | 74.246 |
| 0.6319444444444444 | 78.722 |
| 0.6326388888888889 | 78.722 |
| 0.6333333333333333 | 78.722 |
| 0.6340277777777777 | 74.246 |
| 0.6347222222222222 | 74.246 |
| 0.6354166666666666 | 69.775 |
| 0.6361111111111112 | 65.31 |
| 0.6368055555555555 | 65.31 |
| 0.6375000000000001 | 60.85 |
| 0.6381944444444444 | 60.85 |
| 0.638888888888889 | 56.398 |
| 0.6395833333333333 | 56.398 |
| 0.6402777777777778 | 60.85 |
| 0.6409722222222222 | 60.85 |
| 0.6416666666666667 | 65.31 |
| 0.642361111111111 | 69.775 |
| 0.6430555555555556 | 69.775 |
| 0.6437499999999999 | 74.246 |
| 0.6444444444444445 | 74.246 |
| 0.6451388888888888 | 78.722 |
| 0.6458333333333334 | 83.205 |
| 0.6465277777777778 | 87.692 |
| 0.6472222222222223 | 92.184 |
| 0.6479166666666667 | 96.682 |
| 0.6486111111111111 | 105.69 |
| 0.6493055555555556 | 114.716 |
| 0.65 | 119.235 |
| 0.6506944444444445 | 119.235 |
| 0.6513888888888889 | 119.235 |
| 0.6520833333333333 | 114.716 |
| 0.6527777777777778 | 110.201 |
| 0.6534722222222222 | 101.184 |
| 0.6541666666666667 | 92.184 |
| 0.6548611111111111 | 87.692 |
| 0.6555555555555556 | 83.205 |
| 0.65625 | 83.205 |
| 0.6569444444444444 | 83.205 |
| 0.6576388888888889 | 78.722 |
| 0.6583333333333333 | 74.246 |
| 0.6590277777777778 | 69.775 |
| 0.6597222222222222 | 60.85 |
| 0.6604166666666667 | 56.398 |
| 0.6611111111111111 | 51.951 |
| 0.6618055555555555 | 47.511 |
| 0.6625 | 47.511 |
| 0.6631944444444444 | 47.511 |
| 0.6638888888888889 | 43.079 |
| 0.6645833333333333 | 43.079 |
| 0.6652777777777777 | 47.511 |
| 0.6659722222222222 | 51.951 |
| 0.6666666666666666 | 47.511 |
| 0.6673611111111111 | 47.511 |
| 0.6680555555555556 | 47.511 |
| 0.6687500000000001 | 47.511 |
| 0.6694444444444444 | 47.511 |
| 0.6701388888888888 | 47.511 |
| 0.6708333333333334 | 47.511 |
| 0.6715277777777778 | 51.951 |
| 0.6722222222222222 | 60.85 |
| 0.6729166666666666 | 65.31 |
| 0.6736111111111112 | 60.85 |
| 0.6743055555555556 | 60.85 |
| 0.6749999999999999 | 60.85 |
| 0.6756944444444444 | 56.398 |
| 0.6763888888888889 | 56.398 |
| 0.6770833333333334 | 56.398 |
| 0.6777777777777777 | 51.951 |
| 0.6784722222222223 | 47.511 |
| 0.6791666666666667 | 47.511 |
| 0.6798611111111111 | 47.511 |
| 0.6805555555555555 | 47.511 |
| 0.68125 | 47.511 |
| 0.6819444444444445 | 47.511 |
| 0.6826388888888889 | 47.511 |
| 0.6833333333333332 | 47.511 |
| 0.6840277777777778 | 43.079 |
| 0.6847222222222222 | 38.653 |
| 0.6854166666666667 | 38.653 |
| 0.686111111111111 | 34.234 |
| 0.6868055555555556 | 29.823 |
| 0.6875 | 29.823 |
| 0.6881944444444444 | 25.419 |
| 0.688888888888889 | 25.419 |
| 0.6895833333333333 | 21.024 |
| 0.6902777777777778 | 21.024 |
| 0.6909722222222222 | 21.024 |
| 0.6916666666666668 | 16.636 |
| 0.6923611111111111 | 16.636 |
| 0.6930555555555555 | 12.257 |
| 0.69375 | 12.257 |
| 0.6944444444444445 | 12.257 |
| 0.6951388888888889 | 12.257 |
| 0.6958333333333333 | 12.257 |
| 0.6965277777777777 | 7.887 |
| 0.6972222222222223 | 7.887 |
| 0.6979166666666666 | 7.887 |
| 0.6986111111111111 | 7.887 |
| 0.6993055555555556 | 7.887 |
| 0.7000000000000001 | 7.887 |
| 0.7006944444444444 | 3.525 |
| 0.7013888888888888 | 3.525 |
| 0.7020833333333334 | 3.525 |
| 0.7027777777777778 | 3.525 |
| 0.7034722222222222 | 3.525 |
| 0.7041666666666666 | 3.525 |
| 0.7048611111111112 | 0 |
| 0.7055555555555556 | 0 |
| 0.7062499999999999 | 0 |
| 0.7069444444444444 | 0 |
| 0.7076388888888889 | 0 |
| 0.7083333333333334 | 0 |
| 0.7090277777777777 | 0 |
| 0.7097222222222223 | 0 |
| 0.7104166666666667 | 0 |
| 0.7111111111111111 | 0 |
| 0.7118055555555555 | 0 |
| 0.7125 | 0 |
| 0.7131944444444445 | 0 |
| 0.7138888888888889 | 0 |
| 0.7145833333333332 | 0 |
| 0.7152777777777778 | 0 |
| 0.7159722222222222 | 0 |
| 0.7166666666666667 | 0 |
| 0.717361111111111 | 0 |
| 0.7180555555555556 | 0 |
| 0.71875 | 0 |
| 0.7194444444444444 | 0 |
| 0.720138888888889 | 0 |
| 0.7208333333333333 | 0 |
| 0.7215277777777778 | 0 |
| 0.7222222222222222 | 0 |
| 0.7229166666666668 | 0 |
| 0.7236111111111111 | 0 |
| 0.7243055555555555 | 0 |
| 0.725 | 0 |
| 0.7256944444444445 | 0 |
| 0.7263888888888889 | 0 |
| 0.7270833333333333 | 0 |
| 0.7277777777777777 | 0 |
| 0.7284722222222223 | 0 |
| 0.7291666666666666 | 0 |
| 0.7298611111111111 | 0 |
| 0.7305555555555556 | 0 |
| 0.7312500000000001 | 0 |
| 0.7319444444444444 | 0 |
| 0.7326388888888888 | 0 |
| 0.7333333333333334 | 0 |
| 0.7340277777777778 | 0 |
| 0.7347222222222222 | 0 |
| 0.7354166666666666 | 0 |
| 0.7361111111111112 | 0 |
| 0.7368055555555556 | 0 |
| 0.7374999999999999 | 0 |
| 0.7381944444444444 | 0 |
| 0.7388888888888889 | 0 |
| 0.7395833333333334 | 0 |
| 0.7402777777777777 | 0 |
| 0.7409722222222223 | 0 |
| 0.7416666666666667 | 0 |
| 0.7423611111111111 | 0 |
| 0.7430555555555555 | 0 |
| 0.74375 | 0 |
| 0.7444444444444445 | 0 |
| 0.7451388888888889 | 0 |
| 0.7458333333333332 | 0 |
| 0.7465277777777778 | 0 |
| 0.7472222222222222 | 0 |
| 0.7479166666666667 | 0 |
| 0.748611111111111 | 0 |
| 0.7493055555555556 | 0 |
| 0.75 | 0 |
| 0.7506944444444444 | 0 |
| 0.751388888888889 | 0 |
| 0.7520833333333333 | 0 |
| 0.7527777777777778 | 0 |
| 0.7534722222222222 | 0 |
| 0.7541666666666668 | 0 |
| 0.7548611111111111 | 0 |
| 0.7555555555555555 | 0 |
| 0.75625 | 0 |
| 0.7569444444444445 | 0 |
| 0.7576388888888889 | 0 |
| 0.7583333333333333 | 0 |
| 0.7590277777777777 | 0 |
| 0.7597222222222223 | 0 |
| 0.7604166666666666 | 0 |
| 0.7611111111111111 | 0 |
| 0.7618055555555556 | 0 |
| 0.7625000000000001 | 0 |
| 0.7631944444444444 | 0 |
| 0.7638888888888888 | 0 |
| 0.7645833333333334 | 0 |
| 0.7652777777777778 | 0 |
| 0.7659722222222222 | 0 |
| 0.7666666666666666 | 0 |
| 0.7673611111111112 | 0 |
| 0.7680555555555556 | 0 |
| 0.7687499999999999 | 0 |
| 0.7694444444444444 | 0 |
| 0.7701388888888889 | 0 |
| 0.7708333333333334 | 0 |
| 0.7715277777777777 | 0 |
| 0.7722222222222223 | 0 |
| 0.7729166666666667 | 0 |
| 0.7736111111111111 | 0 |
| 0.7743055555555555 | 0 |
| 0.775 | 0 |
| 0.7756944444444445 | 0 |
| 0.7763888888888889 | 0 |
| 0.7770833333333332 | 0 |
| 0.7777777777777778 | 0 |
| 0.7784722222222222 | 0 |
| 0.7791666666666667 | 0 |
| 0.779861111111111 | 0 |
| 0.7805555555555556 | 0 |
| 0.78125 | 0 |
| 0.7819444444444444 | 0 |
| 0.782638888888889 | 0 |
| 0.7833333333333333 | 0 |
| 0.7840277777777778 | 0 |
| 0.7847222222222222 | 0 |
| 0.7854166666666668 | 0 |
| 0.7861111111111111 | 0 |
| 0.7868055555555555 | 0 |
| 0.7875 | 0 |
| 0.7881944444444445 | 0 |
| 0.7888888888888889 | 0 |
| 0.7895833333333333 | 0 |
| 0.7902777777777777 | 0 |
| 0.7909722222222223 | 0 |
| 0.7916666666666666 | 0 |
| 0.7923611111111111 | 0 |
| 0.7930555555555556 | 0 |
| 0.7937500000000001 | 0 |
| 0.7944444444444444 | 0 |
| 0.7951388888888888 | 0 |
| 0.7958333333333334 | 0 |
| 0.7965277777777778 | 0 |
| 0.7972222222222222 | 0 |
| 0.7979166666666666 | 0 |
| 0.7986111111111112 | 0 |
| 0.7993055555555556 | 0 |
| 0.7999999999999999 | 0 |
| 0.8006944444444444 | 0 |
| 0.8013888888888889 | 0 |
| 0.8020833333333334 | 0 |
| 0.8027777777777777 | 0 |
| 0.8034722222222223 | 0 |
| 0.8041666666666667 | 0 |
| 0.8048611111111111 | 0 |
| 0.8055555555555555 | 0 |
| 0.80625 | 0 |
| 0.8069444444444445 | 0 |
| 0.8076388888888889 | 0 |
| 0.8083333333333332 | 0 |
| 0.8090277777777778 | 0 |
| 0.8097222222222222 | 0 |
| 0.8104166666666667 | 0 |
| 0.811111111111111 | 0 |
| 0.8118055555555556 | 0 |
| 0.8125 | 0 |
| 0.8131944444444444 | 0 |
| 0.813888888888889 | 0 |
| 0.8145833333333333 | 0 |
| 0.8152777777777778 | 0 |
| 0.8159722222222222 | 0 |
| 0.8166666666666668 | 0 |
| 0.8173611111111111 | 0 |
| 0.8180555555555555 | 0 |
| 0.81875 | 0 |
| 0.8194444444444445 | 0 |
| 0.8201388888888889 | 0 |
| 0.8208333333333333 | 0 |
| 0.8215277777777777 | 0 |
| 0.8222222222222223 | 0 |
| 0.8229166666666666 | 0 |
| 0.8236111111111111 | 0 |
| 0.8243055555555556 | 0 |
| 0.8250000000000001 | 0 |
| 0.8256944444444444 | 0 |
| 0.8263888888888888 | 0 |
| 0.8270833333333334 | 0 |
| 0.8277777777777778 | 0 |
| 0.8284722222222222 | 0 |
| 0.8291666666666666 | 0 |
| 0.8298611111111112 | 0 |
| 0.8305555555555556 | 0 |
| 0.8312499999999999 | 0 |
| 0.8319444444444444 | 0 |
| 0.8326388888888889 | 0 |
| 0.8333333333333334 | 0 |
| 0.8340277777777777 | 0 |
| 0.8347222222222223 | 0 |
| 0.8354166666666667 | 0 |
| 0.8361111111111111 | 0 |
| 0.8368055555555555 | 0 |
| 0.8375 | 0 |
| 0.8381944444444445 | 0 |
| 0.8388888888888889 | 0 |
| 0.8395833333333332 | 0 |
| 0.8402777777777778 | 0 |
| 0.8409722222222222 | 0 |
| 0.8416666666666667 | 0 |
| 0.842361111111111 | 0 |
| 0.8430555555555556 | 0 |
| 0.84375 | 0 |
| 0.8444444444444444 | 0 |
| 0.845138888888889 | 0 |
| 0.8458333333333333 | 0 |
| 0.8465277777777778 | 0 |
| 0.8472222222222222 | 0 |
| 0.8479166666666668 | 0 |
| 0.8486111111111111 | 0 |
| 0.8493055555555555 | 0 |
| 0.85 | 0 |
| 0.8506944444444445 | 0 |
| 0.8513888888888889 | 0 |
| 0.8520833333333333 | 0 |
| 0.8527777777777777 | 0 |
| 0.8534722222222223 | 0 |
| 0.8541666666666666 | 0 |
| 0.8548611111111111 | 0 |
| 0.8555555555555556 | 0 |
| 0.8562500000000001 | 0 |
| 0.8569444444444444 | 0 |
| 0.8576388888888888 | 0 |
| 0.8583333333333334 | 0 |
| 0.8590277777777778 | 0 |
| 0.8597222222222222 | 0 |
| 0.8604166666666666 | 0 |
| 0.8611111111111112 | 0 |
| 0.8618055555555556 | 0 |
| 0.8624999999999999 | 0 |
| 0.8631944444444444 | 0 |
| 0.8638888888888889 | 0 |
| 0.8645833333333334 | 0 |
| 0.8652777777777777 | 0 |
| 0.8659722222222223 | 0 |
| 0.8666666666666667 | 0 |
| 0.8673611111111111 | 0 |
| 0.8680555555555555 | 0 |
| 0.86875 | 0 |
| 0.8694444444444445 | 0 |
| 0.8701388888888889 | 0 |
| 0.8708333333333332 | 0 |
| 0.8715277777777778 | 0 |
| 0.8722222222222222 | 0 |
| 0.8729166666666667 | 0 |
| 0.873611111111111 | 0 |
| 0.8743055555555556 | 0 |
| 0.875 | 0 |
| 0.8756944444444444 | 0 |
| 0.876388888888889 | 0 |
| 0.8770833333333333 | 0 |
| 0.8777777777777778 | 0 |
| 0.8784722222222222 | 0 |
| 0.8791666666666668 | 0 |
| 0.8798611111111111 | 0 |
| 0.8805555555555555 | 0 |
| 0.88125 | 0 |
| 0.8819444444444445 | 0 |
| 0.8826388888888889 | 0 |
| 0.8833333333333333 | 0 |
| 0.8840277777777777 | 0 |
| 0.8847222222222223 | 0 |
| 0.8854166666666666 | 0 |
| 0.8861111111111111 | 0 |
| 0.8868055555555556 | 0 |
| 0.8875000000000001 | 0 |
| 0.8881944444444444 | 0 |
| 0.8888888888888888 | 0 |
| 0.8895833333333334 | 0 |
| 0.8902777777777778 | 0 |
| 0.8909722222222222 | 0 |
| 0.8916666666666666 | 0 |
| 0.8923611111111112 | 0 |
| 0.8930555555555556 | 0 |
| 0.8937499999999999 | 0 |
| 0.8944444444444444 | 0 |
| 0.8951388888888889 | 0 |
| 0.8958333333333334 | 0 |
| 0.8965277777777777 | 0 |
| 0.8972222222222223 | 0 |
| 0.8979166666666667 | 0 |
| 0.8986111111111111 | 0 |
| 0.8993055555555555 | 0 |
| 0.9 | 0 |
| 0.9006944444444445 | 0 |
| 0.9013888888888889 | 0 |
| 0.9020833333333332 | 0 |
| 0.9027777777777778 | 0 |
| 0.9034722222222222 | 0 |
| 0.9041666666666667 | 0 |
| 0.904861111111111 | 0 |
| 0.9055555555555556 | 0 |
| 0.90625 | 0 |
| 0.9069444444444444 | 0 |
| 0.907638888888889 | 0 |
| 0.9083333333333333 | 0 |
| 0.9090277777777778 | 0 |
| 0.9097222222222222 | 0 |
| 0.9104166666666668 | 0 |
| 0.9111111111111111 | 0 |
| 0.9118055555555555 | 0 |
| 0.9125 | 0 |
| 0.9131944444444445 | 0 |
| 0.9138888888888889 | 0 |
| 0.9145833333333333 | 0 |
| 0.9152777777777777 | 0 |
| 0.9159722222222223 | 0 |
| 0.9166666666666666 | 0 |
| 0.9173611111111111 | 0 |
| 0.9180555555555556 | 0 |
| 0.9187500000000001 | 0 |
| 0.9194444444444444 | 0 |
| 0.9201388888888888 | 0 |
| 0.9208333333333334 | 0 |
| 0.9215277777777778 | 0 |
| 0.9222222222222222 | 0 |
| 0.9229166666666666 | 0 |
| 0.9236111111111112 | 0 |
| 0.9243055555555556 | 0 |
| 0.9249999999999999 | 0 |
| 0.9256944444444444 | 0 |
| 0.9263888888888889 | 0 |
| 0.9270833333333334 | 0 |
| 0.9277777777777777 | 0 |
| 0.9284722222222223 | 0 |
| 0.9291666666666667 | 0 |
| 0.9298611111111111 | 0 |
| 0.9305555555555555 | 0 |
| 0.93125 | 0 |
| 0.9319444444444445 | 0 |
| 0.9326388888888889 | 0 |
| 0.9333333333333332 | 0 |
| 0.9340277777777778 | 0 |
| 0.9347222222222222 | 0 |
| 0.9354166666666667 | 0 |
| 0.936111111111111 | 0 |
| 0.9368055555555556 | 0 |
| 0.9375 | 0 |
| 0.9381944444444444 | 0 |
| 0.938888888888889 | 0 |
| 0.9395833333333333 | 0 |
| 0.9402777777777778 | 0 |
| 0.9409722222222222 | 0 |
| 0.9416666666666668 | 0 |
| 0.9423611111111111 | 0 |
| 0.9430555555555555 | 0 |
| 0.94375 | 0 |
| 0.9444444444444445 | 0 |
| 0.9451388888888889 | 0 |
| 0.9458333333333333 | 0 |
| 0.9465277777777777 | 0 |
| 0.9472222222222223 | 0 |
| 0.9479166666666666 | 0 |
| 0.9486111111111111 | 0 |
| 0.9493055555555556 | 0 |
| 0.9500000000000001 | 0 |
| 0.9506944444444444 | 0 |
| 0.9513888888888888 | 0 |
| 0.9520833333333334 | 0 |
| 0.9527777777777778 | 0 |
| 0.9534722222222222 | 0 |
| 0.9541666666666666 | 0 |
| 0.9548611111111112 | 0 |
| 0.9555555555555556 | 0 |
| 0.9562499999999999 | 0 |
| 0.9569444444444444 | 0 |
| 0.9576388888888889 | 0 |
| 0.9583333333333334 | 0 |
| 0.9590277777777777 | 0 |
| 0.9597222222222223 | 0 |
| 0.9604166666666667 | 0 |
| 0.9611111111111111 | 0 |
| 0.9618055555555555 | 0 |
| 0.9625 | 0 |
| 0.9631944444444445 | 0 |
| 0.9638888888888889 | 0 |
| 0.9645833333333332 | 0 |
| 0.9652777777777778 | 0 |
| 0.9659722222222222 | 0 |
| 0.9666666666666667 | 0 |
| 0.967361111111111 | 0 |
| 0.9680555555555556 | 0 |
| 0.96875 | 0 |
| 0.9694444444444444 | 0 |
| 0.970138888888889 | 0 |
| 0.9708333333333333 | 0 |
| 0.9715277777777778 | 0 |
| 0.9722222222222222 | 0 |
| 0.9729166666666668 | 0 |
| 0.9736111111111111 | 0 |
| 0.9743055555555555 | 0 |
| 0.975 | 0 |
| 0.9756944444444445 | 0 |
| 0.9763888888888889 | 0 |
| 0.9770833333333333 | 0 |
| 0.9777777777777777 | 0 |
| 0.9784722222222223 | 0 |
| 0.9791666666666666 | 0 |
| 0.9798611111111111 | 0 |
| 0.9805555555555556 | 0 |
| 0.9812500000000001 | 0 |
| 0.9819444444444444 | 0 |
| 0.9826388888888888 | 0 |
| 0.9833333333333334 | 0 |
| 0.9840277777777778 | 0 |
| 0.9847222222222222 | 0 |
| 0.9854166666666666 | 0 |
| 0.9861111111111112 | 0 |
| 0.9868055555555556 | 0 |
| 0.9874999999999999 | 0 |
| 0.9881944444444444 | 0 |
| 0.9888888888888889 | 0 |
| 0.9895833333333334 | 0 |
| 0.9902777777777777 | 0 |
| 0.9909722222222223 | 0 |
| 0.9916666666666667 | 0 |
| 0.9923611111111111 | 0 |
| 0.9930555555555555 | 0 |
| 0.99375 | 0 |
| 0.9944444444444445 | 0 |
| 0.9951388888888889 | 0 |
| 0.9958333333333332 | 0 |
| 0.9965277777777778 | 0 |
| 0.9972222222222222 | 0 |
| 0.9979166666666667 | 0 |
| 0.998611111111111 | 0 |
| 0.9993055555555556 | 0 |